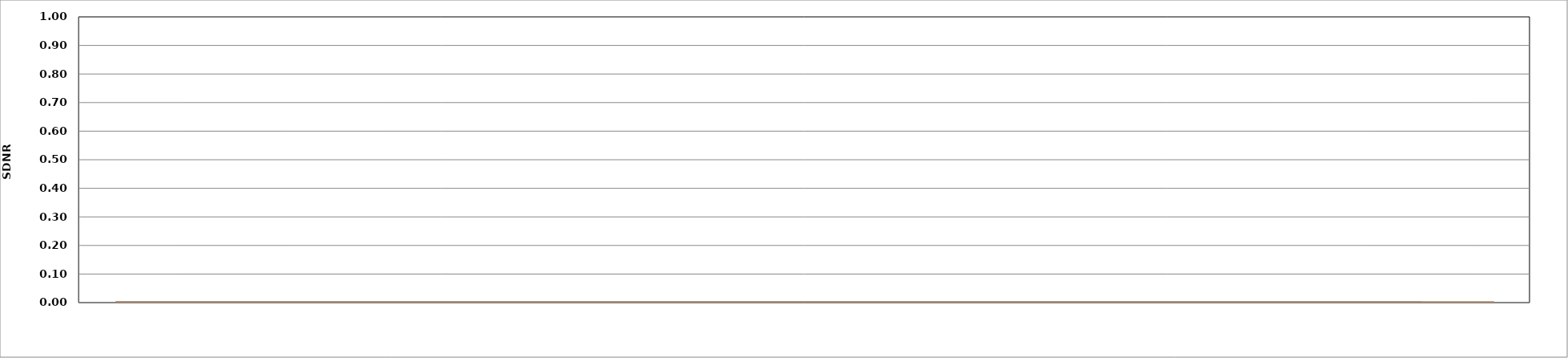
| Category | Series 3 | Series 4 | Series 5 |
|---|---|---|---|
|  | 0 | 0 | 0 |
|  | 0 | 0 | 0 |
|  | 0 | 0 | 0 |
|  | 0 | 0 | 0 |
|  | 0 | 0 | 0 |
|  | 0 | 0 | 0 |
|  | 0 | 0 | 0 |
|  | 0 | 0 | 0 |
|  | 0 | 0 | 0 |
|  | 0 | 0 | 0 |
|  | 0 | 0 | 0 |
|  | 0 | 0 | 0 |
|  | 0 | 0 | 0 |
|  | 0 | 0 | 0 |
|  | 0 | 0 | 0 |
|  | 0 | 0 | 0 |
|  | 0 | 0 | 0 |
|  | 0 | 0 | 0 |
|  | 0 | 0 | 0 |